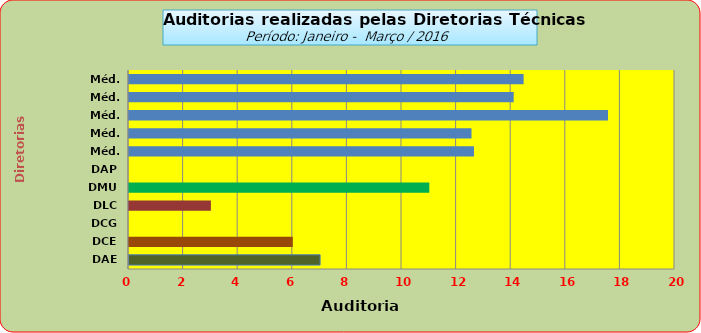
| Category | Series 0 |
|---|---|
| DAE | 7 |
| DCE | 6 |
| DCG | 0 |
| DLC | 3 |
| DMU | 11 |
| DAP | 0 |
| Méd. 2011 | 12.636 |
| Méd. 2012 | 12.545 |
| Méd. 2013 | 17.545 |
| Méd. 2014 | 14.091 |
| Méd. 2014 | 14.455 |